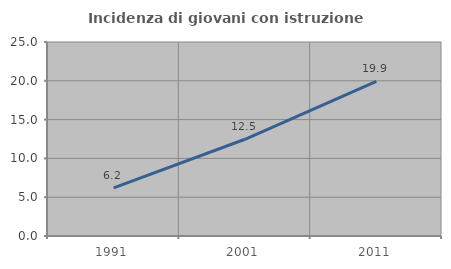
| Category | Incidenza di giovani con istruzione universitaria |
|---|---|
| 1991.0 | 6.196 |
| 2001.0 | 12.465 |
| 2011.0 | 19.922 |